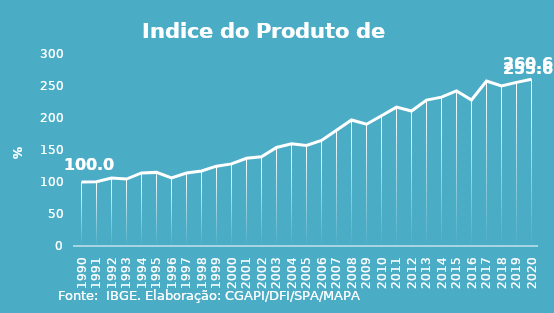
| Category | Indice de Prod. base 1990 |
|---|---|
| 1990.0 | 100 |
| 1991.0 | 100.275 |
| 1992.0 | 106.203 |
| 1993.0 | 104.57 |
| 1994.0 | 114.164 |
| 1995.0 | 115.024 |
| 1996.0 | 106.552 |
| 1997.0 | 114.037 |
| 1998.0 | 117.319 |
| 1999.0 | 124.734 |
| 2000.0 | 128.293 |
| 2001.0 | 136.975 |
| 2002.0 | 139.51 |
| 2003.0 | 153.868 |
| 2004.0 | 159.641 |
| 2005.0 | 157.136 |
| 2006.0 | 164.858 |
| 2007.0 | 180.781 |
| 2008.0 | 196.91 |
| 2009.0 | 190.309 |
| 2010.0 | 203.581 |
| 2011.0 | 217.041 |
| 2012.0 | 210.932 |
| 2013.0 | 228.009 |
| 2014.0 | 232.562 |
| 2015.0 | 242.318 |
| 2016.0 | 228.239 |
| 2017.0 | 257.766 |
| 2018.0 | 250.124 |
| 2019.0 | 255.64 |
| 2020.0 | 260.579 |